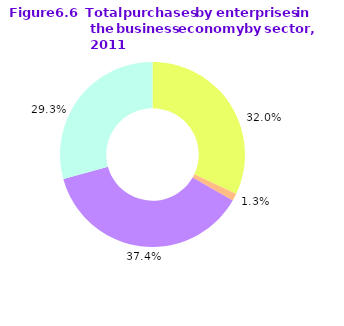
| Category | Series 0 |
|---|---|
| Industry | 0.32 |
| Construction | 0.013 |
| Distribution | 0.374 |
| Services | 0.293 |